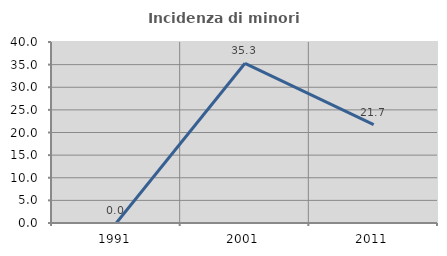
| Category | Incidenza di minori stranieri |
|---|---|
| 1991.0 | 0 |
| 2001.0 | 35.294 |
| 2011.0 | 21.739 |